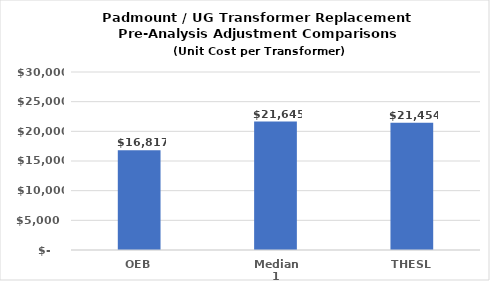
| Category | Series 0 |
|---|---|
| OEB | 16817 |
| Median 1 | 21645.055 |
| THESL | 21454 |